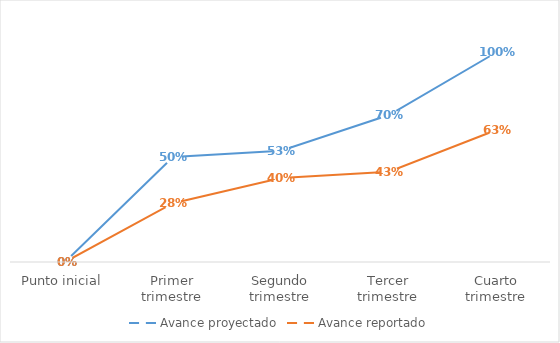
| Category | Avance proyectado | Avance reportado |
|---|---|---|
| Punto inicial | 0 | 0 |
| Primer trimestre | 0.5 | 0.28 |
| Segundo trimestre | 0.53 | 0.4 |
| Tercer trimestre | 0.7 | 0.43 |
| Cuarto trimestre | 1 | 0.63 |